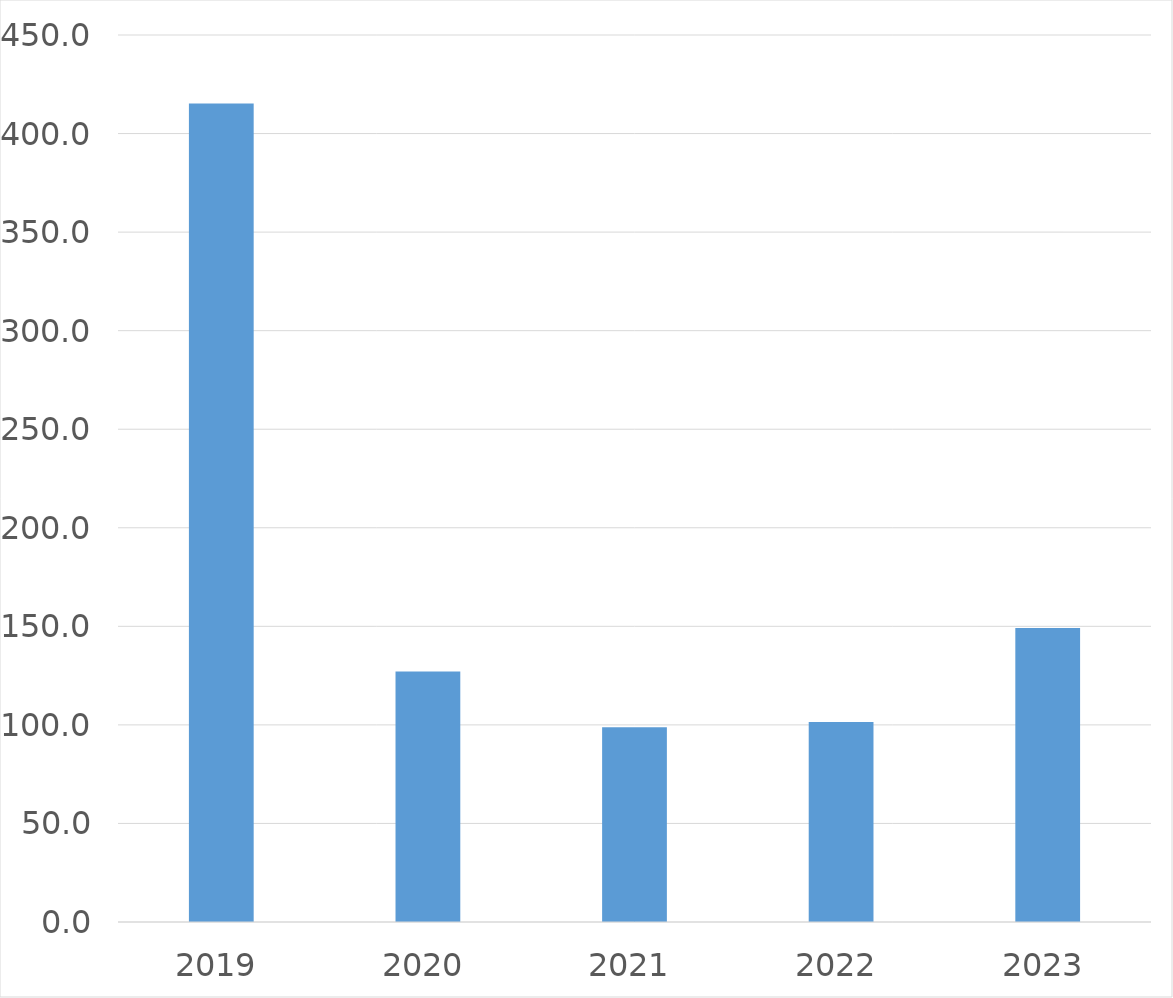
| Category | Series 0 |
|---|---|
| 2019 | 415.2 |
| 2020 | 127.1 |
| 2021 | 98.8 |
| 2022 | 101.5 |
| 2023 | 149.1 |